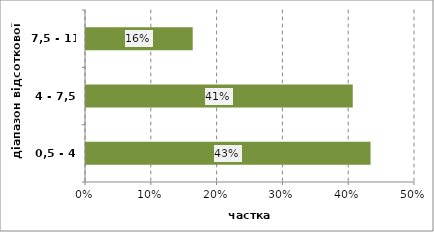
| Category | Series 0 |
|---|---|
| 0,5 - 4 | 0.432 |
| 4 - 7,5 | 0.405 |
| 7,5 - 11 | 0.162 |